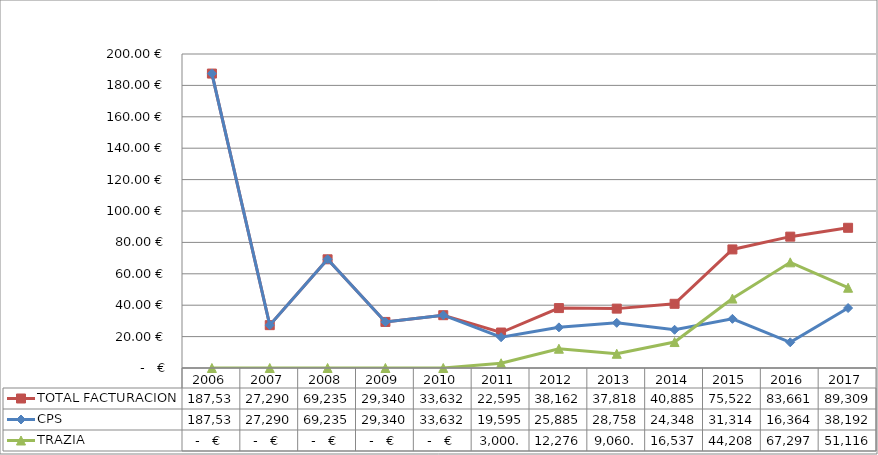
| Category | TOTAL FACTURACION | CPS | TRAZIA |
|---|---|---|---|
| 2006.0 | 187536.67 | 187536.67 | 0 |
| 2007.0 | 27290.02 | 27290.02 | 0 |
| 2008.0 | 69235.34 | 69235.34 | 0 |
| 2009.0 | 29340.47 | 29340.47 | 0 |
| 2010.0 | 33632.95 | 33632.95 | 0 |
| 2011.0 | 22595.14 | 19595.14 | 3000 |
| 2012.0 | 38162.06 | 25885.1 | 12276.96 |
| 2013.0 | 37818.89 | 28758.89 | 9060 |
| 2014.0 | 40885.37 | 24348.37 | 16537 |
| 2015.0 | 75522.69 | 31314.21 | 44208.48 |
| 2016.0 | 83661.13 | 16364.13 | 67297 |
| 2017.0 | 89309.64 | 38192.84 | 51116.8 |